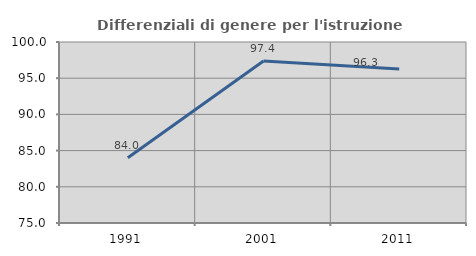
| Category | Differenziali di genere per l'istruzione superiore |
|---|---|
| 1991.0 | 84.006 |
| 2001.0 | 97.374 |
| 2011.0 | 96.261 |